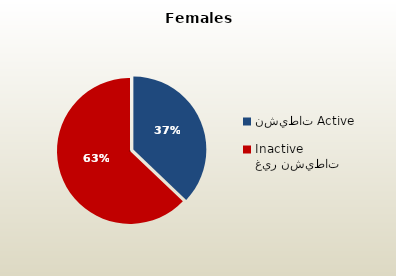
| Category | الاناث القطريات  Qatari Females |
|---|---|
| نشيطات Active | 40035 |
| غير نشيطات Inactive | 67830 |